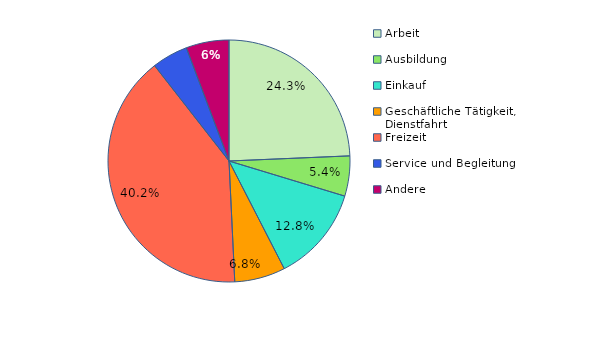
| Category | Series 0 |
|---|---|
| Arbeit | 24.324 |
| Ausbildung | 5.362 |
| Einkauf | 12.769 |
| Geschäftliche Tätigkeit, Dienstfahrt | 6.785 |
| Freizeit | 40.213 |
| Service und Begleitung | 4.81 |
| Andere | 5.738 |